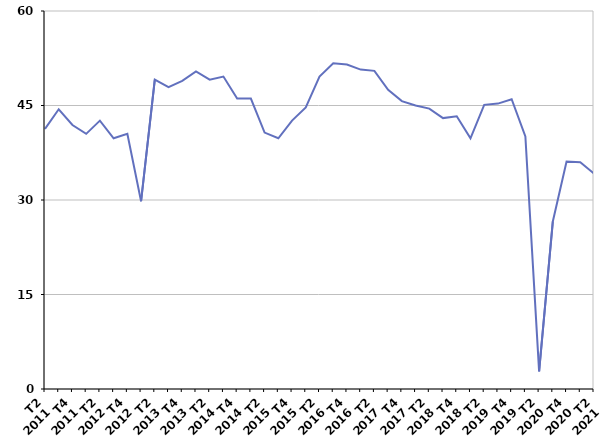
| Category | Radiation administrative |
|---|---|
| T2
2011 | 41.3 |
| T3
2011 | 44.4 |
| T4
2011 | 41.9 |
| T1
2012 | 40.5 |
| T2
2012 | 42.6 |
| T3
2012 | 39.8 |
| T4
2012 | 40.5 |
| T1
2013 | 29.8 |
| T2
2013 | 49.1 |
| T3
2013 | 47.9 |
| T4
2013 | 48.9 |
| T1
2014 | 50.4 |
| T2
2014 | 49.1 |
| T3
2014 | 49.6 |
| T4
2014 | 46.1 |
| T1
2015 | 46.1 |
| T2
2015 | 40.7 |
| T3
2015 | 39.8 |
| T4
2015 | 42.6 |
| T1
2016 | 44.7 |
| T2
2016 | 49.6 |
| T3
2016 | 51.7 |
| T4
2016 | 51.5 |
| T1
2017 | 50.7 |
| T2
2017 | 50.5 |
| T3
2017 | 47.5 |
| T4
2017 | 45.7 |
| T1
2018 | 45 |
| T2
2018 | 44.5 |
| T3
2018 | 43 |
| T4
2018 | 43.3 |
| T1
2019 | 39.8 |
| T2
2019 | 45.1 |
| T3
2019 | 45.3 |
| T4
2019 | 46 |
| T1
2020 | 40.1 |
| T2
2020 | 2.8 |
| T3
2020 | 26.6 |
| T4
2020 | 36.1 |
| T1
2021 | 36 |
| T2
2021 | 34.2 |